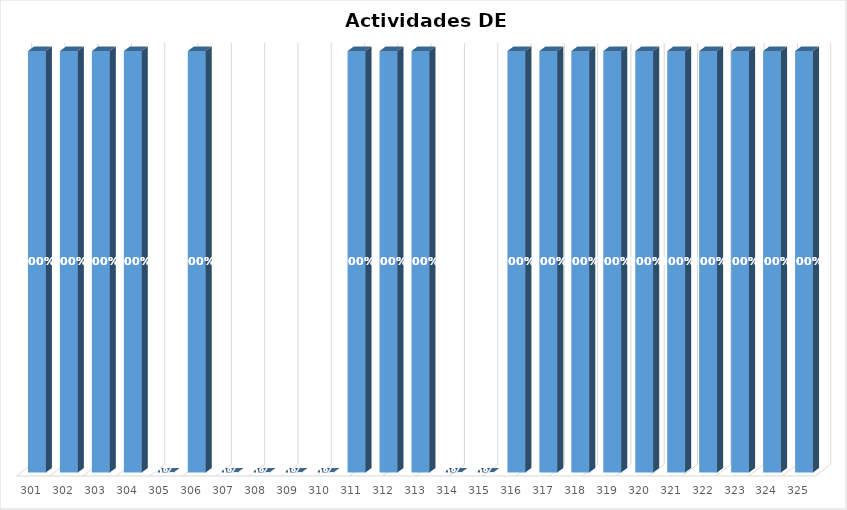
| Category | % Avance |
|---|---|
| 301.0 | 1 |
| 302.0 | 1 |
| 303.0 | 1 |
| 304.0 | 1 |
| 305.0 | 0 |
| 306.0 | 1 |
| 307.0 | 0 |
| 308.0 | 0 |
| 309.0 | 0 |
| 310.0 | 0 |
| 311.0 | 1 |
| 312.0 | 1 |
| 313.0 | 1 |
| 314.0 | 0 |
| 315.0 | 0 |
| 316.0 | 1 |
| 317.0 | 1 |
| 318.0 | 1 |
| 319.0 | 1 |
| 320.0 | 1 |
| 321.0 | 1 |
| 322.0 | 1 |
| 323.0 | 1 |
| 324.0 | 1 |
| 325.0 | 1 |